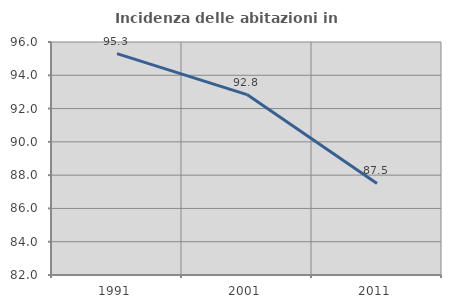
| Category | Incidenza delle abitazioni in proprietà  |
|---|---|
| 1991.0 | 95.299 |
| 2001.0 | 92.839 |
| 2011.0 | 87.5 |